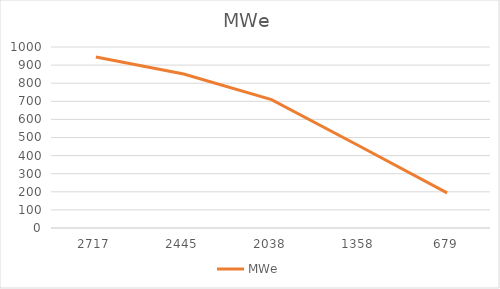
| Category | MWe |
|---|---|
| 2717.0 | 945 |
| 2445.3 | 851 |
| 2037.7 | 709 |
| 1358.0 | 453 |
| 679.0 | 194 |